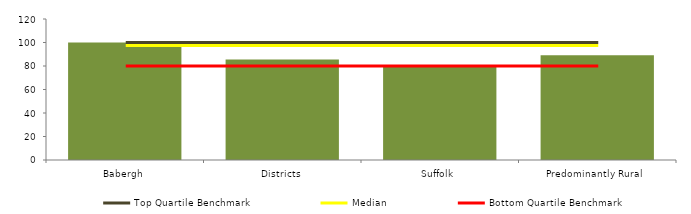
| Category | Block Data |
|---|---|
| Babergh | 100 |
| Districts | 85.59 |
| Suffolk | 79.968 |
|  Predominantly Rural   | 89.049 |